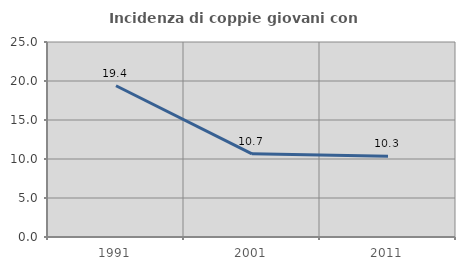
| Category | Incidenza di coppie giovani con figli |
|---|---|
| 1991.0 | 19.394 |
| 2001.0 | 10.667 |
| 2011.0 | 10.345 |